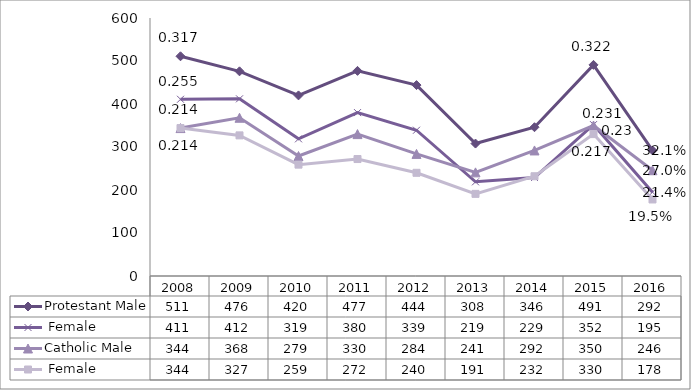
| Category | Protestant | Catholic |
|---|---|---|
| 2008.0 | 411 | 344 |
| 2009.0 | 412 | 327 |
| 2010.0 | 319 | 259 |
| 2011.0 | 380 | 272 |
| 2012.0 | 339 | 240 |
| 2013.0 | 219 | 191 |
| 2014.0 | 229 | 232 |
| 2015.0 | 352 | 330 |
| 2016.0 | 195 | 178 |